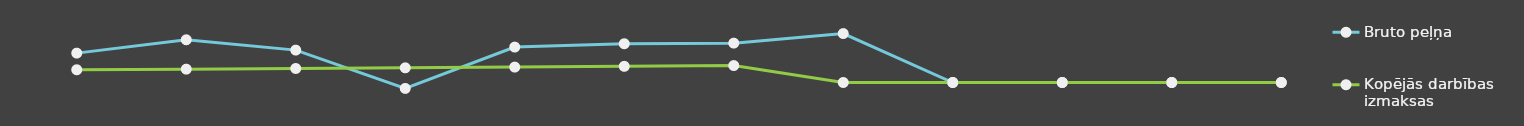
| Category | Bruto peļņa | Kopējās darbības izmaksas |
|---|---|---|
| 0 | 25000 | 10841 |
| 1 | 36348 | 11367.25 |
| 2 | 27562 | 11919.82 |
| 3 | -5059.5 | 12500.01 |
| 4 | 30153.18 | 13109.21 |
| 5 | 32964.45 | 13748.86 |
| 6 | 33502.87 | 14420.51 |
| 7 | 41646 | 0 |
| 8 | 0 | 0 |
| 9 | 0 | 0 |
| 10 | 0 | 0 |
| 11 | 0 | 0 |